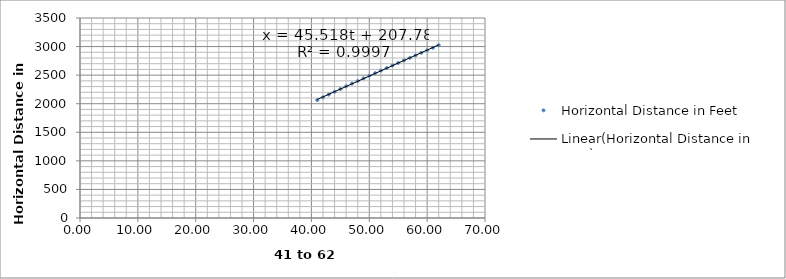
| Category | Horizontal Distance in Feet |
|---|---|
| 41.0 | 2062.198 |
| 42.0 | 2111.514 |
| 43.0 | 2160.282 |
| 44.0 | 2208.796 |
| 45.0 | 2257.199 |
| 46.0 | 2304.89 |
| 47.0 | 2351.927 |
| 48.0 | 2398.352 |
| 49.0 | 2444.212 |
| 50.0 | 2489.874 |
| 51.0 | 2535.044 |
| 52.0 | 2579.805 |
| 53.0 | 2624.416 |
| 54.0 | 2668.718 |
| 55.0 | 2713 |
| 56.0 | 2757.206 |
| 57.0 | 2801.155 |
| 58.0 | 2845.69 |
| 59.0 | 2890.351 |
| 60.0 | 2934.78 |
| 61.0 | 2979.443 |
| 62.0 | 3024.174 |